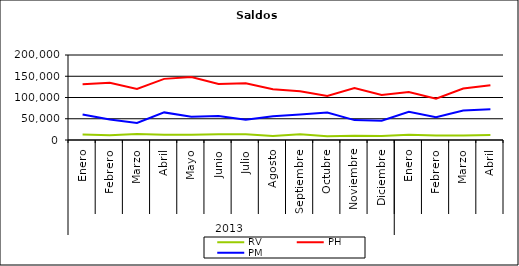
| Category | RV | PH | PM |
|---|---|---|---|
| 0 | 12966.437 | 131380.856 | 59975.653 |
| 1 | 11432.271 | 134655.891 | 48046.612 |
| 2 | 14149.543 | 120343.782 | 40297.909 |
| 3 | 12403.249 | 143830.507 | 64946.114 |
| 4 | 12323.134 | 148139.781 | 54592.514 |
| 5 | 13759.976 | 131634.752 | 56652.701 |
| 6 | 13256.014 | 133515.147 | 47907.561 |
| 7 | 9335.8 | 119600.732 | 55860.576 |
| 8 | 13362.811 | 114843.232 | 59771.51 |
| 9 | 9080.978 | 103607.627 | 64696.186 |
| 10 | 9993.913 | 122533.872 | 46801.148 |
| 11 | 9303.464 | 105747.395 | 45455.331 |
| 12 | 12145.055 | 112918.262 | 66200.17 |
| 13 | 10742.048 | 97242.789 | 53817.215 |
| 14 | 10795.854 | 121097.504 | 69409.543 |
| 15 | 11604.091 | 128798.176 | 72161.549 |